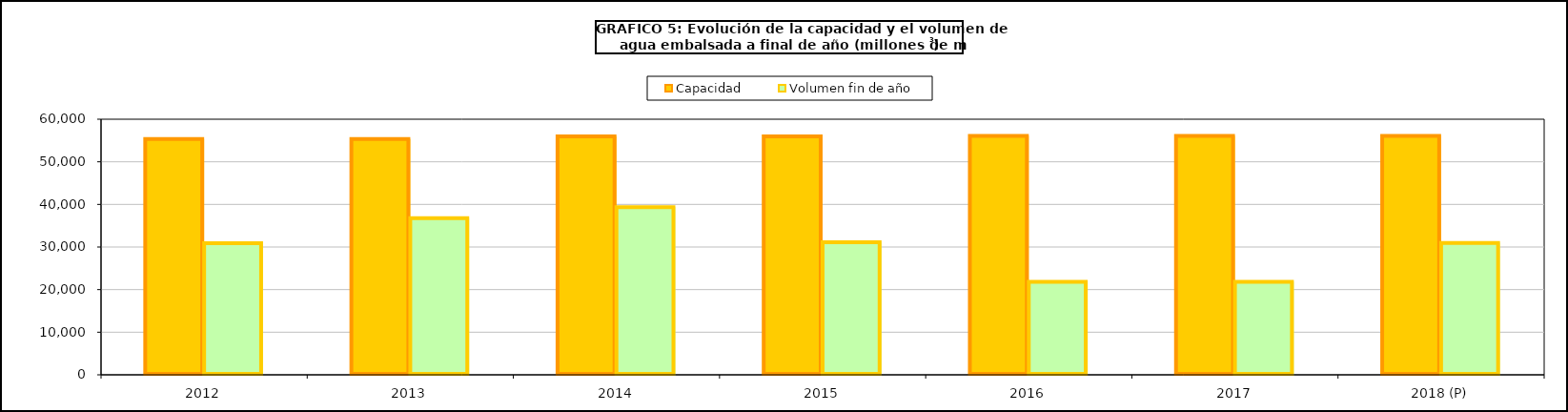
| Category | Capacidad | Volumen fin de año |
|---|---|---|
| 2012 | 55327 | 30872 |
| 2013 | 55343 | 36761 |
| 2014 | 55977 | 39350 |
| 2015 | 55977 | 31121 |
| 2016 | 56075 | 21832 |
| 2017 | 56074 | 21832 |
| 2018 (P) | 56074 | 30936 |